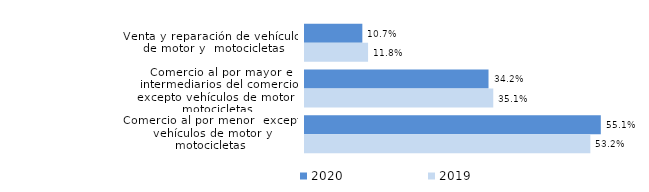
| Category | 2020 | 2019 |
|---|---|---|
| Venta y reparación de vehículos de motor y  motocicletas | 0.107 | 0.118 |
| Comercio al por mayor e intermediarios del comercio, excepto vehículos de motor y motocicletas | 0.342 | 0.351 |
| Comercio al por menor  excepto vehículos de motor y motocicletas | 0.551 | 0.532 |